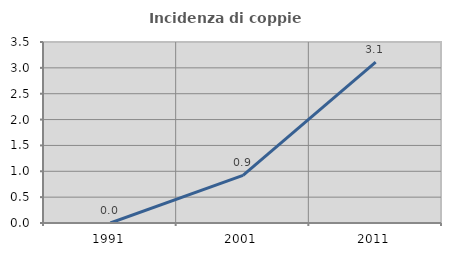
| Category | Incidenza di coppie miste |
|---|---|
| 1991.0 | 0 |
| 2001.0 | 0.922 |
| 2011.0 | 3.109 |